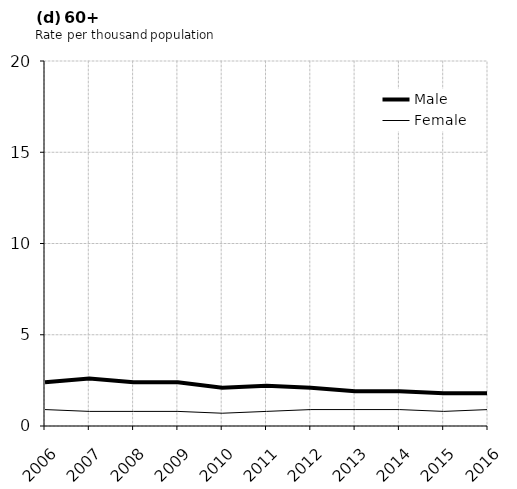
| Category | Male | Female |
|---|---|---|
| 2006.0 | 2.4 | 0.9 |
| 2007.0 | 2.6 | 0.8 |
| 2008.0 | 2.4 | 0.8 |
| 2009.0 | 2.4 | 0.8 |
| 2010.0 | 2.1 | 0.7 |
| 2011.0 | 2.2 | 0.8 |
| 2012.0 | 2.1 | 0.9 |
| 2013.0 | 1.9 | 0.9 |
| 2014.0 | 1.9 | 0.9 |
| 2015.0 | 1.8 | 0.8 |
| 2016.0 | 1.8 | 0.9 |